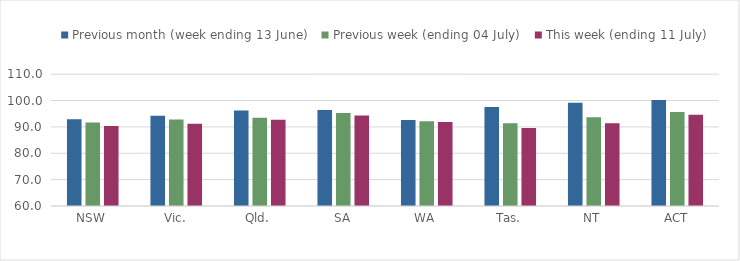
| Category | Previous month (week ending 13 June) | Previous week (ending 04 July) | This week (ending 11 July) |
|---|---|---|---|
| NSW | 92.923 | 91.629 | 90.329 |
| Vic. | 94.238 | 92.83 | 91.237 |
| Qld. | 96.267 | 93.507 | 92.707 |
| SA | 96.374 | 95.293 | 94.309 |
| WA | 92.575 | 92.114 | 91.895 |
| Tas. | 97.506 | 91.368 | 89.614 |
| NT | 99.19 | 93.653 | 91.359 |
| ACT | 100.219 | 95.621 | 94.589 |